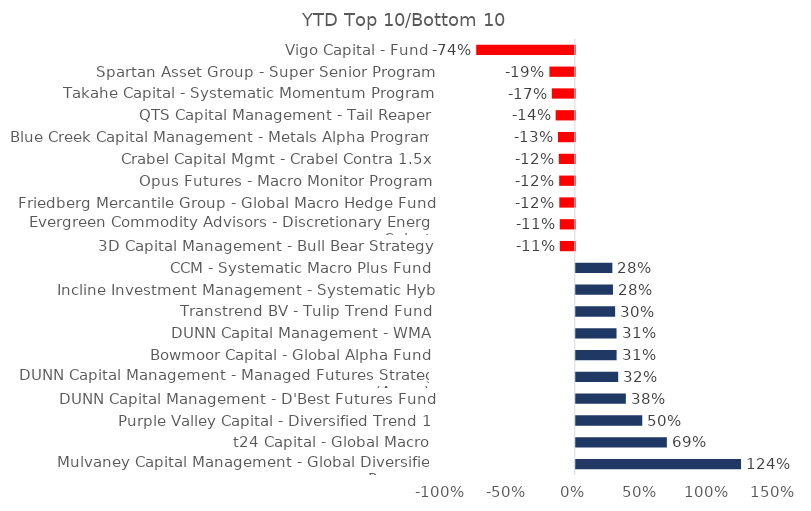
| Category | Series 0 |
|---|---|
| Mulvaney Capital Management - Global Diversified Program | 1.244 |
| t24 Capital - Global Macro | 0.686 |
| Purple Valley Capital - Diversified Trend 1 | 0.5 |
| DUNN Capital Management - D'Best Futures Fund | 0.377 |
| DUNN Capital Management - Managed Futures Strategy (Arrow) | 0.319 |
| Bowmoor Capital - Global Alpha Fund | 0.307 |
| DUNN Capital Management - WMA | 0.307 |
| Transtrend BV - Tulip Trend Fund | 0.296 |
| Incline Investment Management - Systematic Hyb | 0.28 |
| CCM - Systematic Macro Plus Fund | 0.275 |
| 3D Capital Management - Bull Bear Strategy | -0.113 |
| Evergreen Commodity Advisors - Discretionary Energy Select | -0.113 |
| Friedberg Mercantile Group - Global Macro Hedge Fund | -0.117 |
| Opus Futures - Macro Monitor Program | -0.118 |
| Crabel Capital Mgmt - Crabel Contra 1.5x | -0.12 |
| Blue Creek Capital Management - Metals Alpha Program | -0.126 |
| QTS Capital Management - Tail Reaper | -0.144 |
| Takahe Capital - Systematic Momentum Program | -0.173 |
| Spartan Asset Group - Super Senior Program | -0.191 |
| Vigo Capital - Fund | -0.742 |